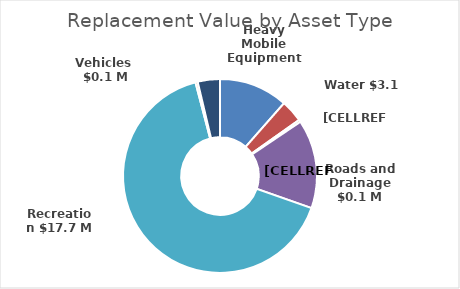
| Category | Series 1 |
|---|---|
| Water | 3100000 |
| Sewer | 1000000 |
| Roads and Drainage | 100000 |
| Buildings | 4000000 |
| Recreation | 17690000 |
| Vehicles  | 100000 |
| Heavy Mobile Equipment | 1000000 |